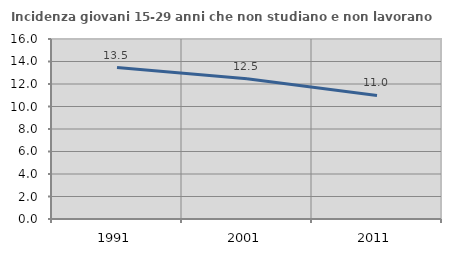
| Category | Incidenza giovani 15-29 anni che non studiano e non lavorano  |
|---|---|
| 1991.0 | 13.456 |
| 2001.0 | 12.465 |
| 2011.0 | 10.983 |